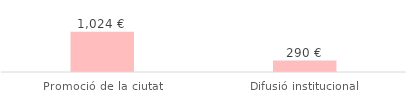
| Category | Total |
|---|---|
| Promoció de la ciutat | 1023.66 |
| Difusió institucional | 290.4 |